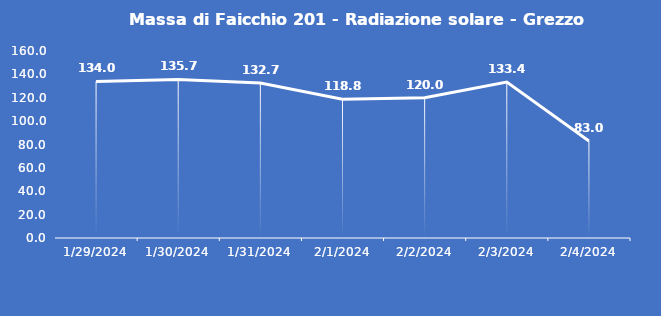
| Category | Massa di Faicchio 201 - Radiazione solare - Grezzo (W/m2) |
|---|---|
| 1/29/24 | 134 |
| 1/30/24 | 135.7 |
| 1/31/24 | 132.7 |
| 2/1/24 | 118.8 |
| 2/2/24 | 120 |
| 2/3/24 | 133.4 |
| 2/4/24 | 83 |